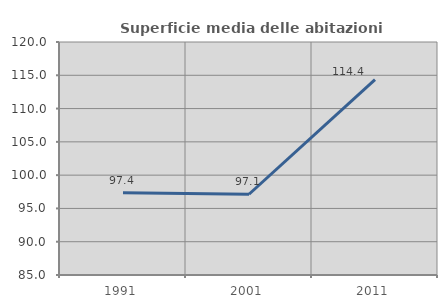
| Category | Superficie media delle abitazioni occupate |
|---|---|
| 1991.0 | 97.351 |
| 2001.0 | 97.129 |
| 2011.0 | 114.357 |